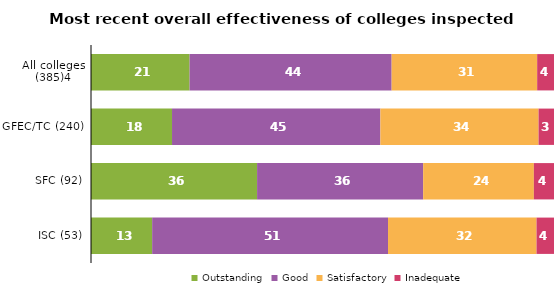
| Category | Outstanding | Good | Satisfactory | Inadequate |
|---|---|---|---|---|
| All colleges (385)4 | 21.299 | 43.636 | 31.429 | 3.636 |
| GFEC/TC (240) | 17.5 | 45 | 34.167 | 3.333 |
| SFC (92) | 35.87 | 35.87 | 23.913 | 4.348 |
| ISC (53) | 13.208 | 50.943 | 32.075 | 3.774 |